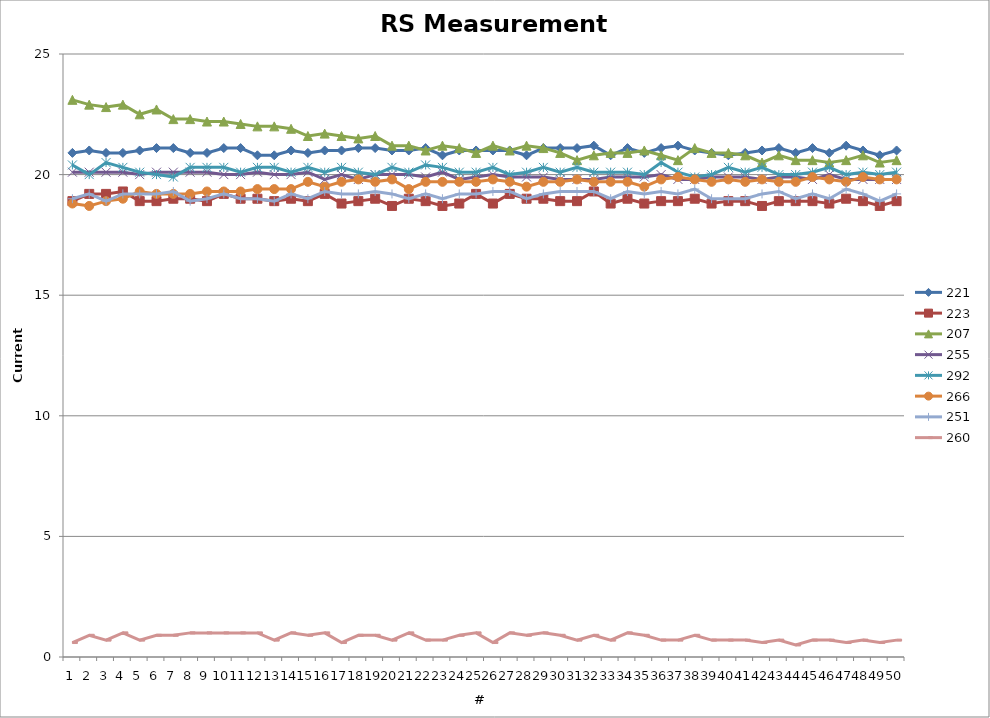
| Category | 221 | 223 | 207 | 255 | 292 | 266 | 251 | 260 |
|---|---|---|---|---|---|---|---|---|
| 0 | 20.9 | 18.9 | 23.1 | 20.1 | 20.4 | 18.8 | 19 | 0.6 |
| 1 | 21 | 19.2 | 22.9 | 20.1 | 20 | 18.7 | 19.2 | 0.9 |
| 2 | 20.9 | 19.2 | 22.8 | 20.1 | 20.5 | 18.9 | 18.9 | 0.7 |
| 3 | 20.9 | 19.3 | 22.9 | 20.1 | 20.3 | 19 | 19.2 | 1 |
| 4 | 21 | 18.9 | 22.5 | 20 | 20.1 | 19.3 | 19.2 | 0.7 |
| 5 | 21.1 | 18.9 | 22.7 | 20.1 | 20 | 19.2 | 19.2 | 0.9 |
| 6 | 21.1 | 19 | 22.3 | 20.1 | 19.9 | 19.2 | 19.3 | 0.9 |
| 7 | 20.9 | 19 | 22.3 | 20.1 | 20.3 | 19.2 | 18.9 | 1 |
| 8 | 20.9 | 18.9 | 22.2 | 20.1 | 20.3 | 19.3 | 19 | 1 |
| 9 | 21.1 | 19.2 | 22.2 | 20 | 20.3 | 19.3 | 19.2 | 1 |
| 10 | 21.1 | 19 | 22.1 | 20 | 20.1 | 19.3 | 19 | 1 |
| 11 | 20.8 | 19 | 22 | 20.1 | 20.3 | 19.4 | 19 | 1 |
| 12 | 20.8 | 18.9 | 22 | 20 | 20.3 | 19.4 | 18.9 | 0.7 |
| 13 | 21 | 19 | 21.9 | 20 | 20.1 | 19.4 | 19.2 | 1 |
| 14 | 20.9 | 18.9 | 21.6 | 20.1 | 20.3 | 19.7 | 19 | 0.9 |
| 15 | 21 | 19.2 | 21.7 | 19.8 | 20.1 | 19.5 | 19.3 | 1 |
| 16 | 21 | 18.8 | 21.6 | 20 | 20.3 | 19.7 | 19.2 | 0.6 |
| 17 | 21.1 | 18.9 | 21.5 | 19.8 | 20.1 | 19.8 | 19.2 | 0.9 |
| 18 | 21.1 | 19 | 21.6 | 20 | 20 | 19.7 | 19.3 | 0.9 |
| 19 | 21 | 18.7 | 21.2 | 20 | 20.3 | 19.8 | 19.2 | 0.7 |
| 20 | 21 | 19 | 21.2 | 20 | 20.1 | 19.4 | 19 | 1 |
| 21 | 21.1 | 18.9 | 21 | 19.9 | 20.4 | 19.7 | 19.2 | 0.7 |
| 22 | 20.8 | 18.7 | 21.2 | 20.1 | 20.3 | 19.7 | 19 | 0.7 |
| 23 | 21 | 18.8 | 21.1 | 19.8 | 20.1 | 19.7 | 19.2 | 0.9 |
| 24 | 21 | 19.2 | 20.9 | 19.9 | 20.1 | 19.7 | 19.2 | 1 |
| 25 | 21 | 18.8 | 21.2 | 20 | 20.3 | 19.8 | 19.3 | 0.6 |
| 26 | 21 | 19.2 | 21 | 19.9 | 20 | 19.7 | 19.3 | 1 |
| 27 | 20.8 | 19 | 21.2 | 19.9 | 20.1 | 19.5 | 19 | 0.9 |
| 28 | 21.1 | 19 | 21.1 | 19.9 | 20.3 | 19.7 | 19.2 | 1 |
| 29 | 21.1 | 18.9 | 20.9 | 19.8 | 20.1 | 19.7 | 19.3 | 0.9 |
| 30 | 21.1 | 18.9 | 20.6 | 19.8 | 20.3 | 19.8 | 19.3 | 0.7 |
| 31 | 21.2 | 19.3 | 20.8 | 19.8 | 20.1 | 19.7 | 19.3 | 0.9 |
| 32 | 20.8 | 18.8 | 20.9 | 19.9 | 20.1 | 19.7 | 19 | 0.7 |
| 33 | 21.1 | 19 | 20.9 | 19.9 | 20.1 | 19.7 | 19.3 | 1 |
| 34 | 20.9 | 18.8 | 21 | 19.9 | 20 | 19.5 | 19.2 | 0.9 |
| 35 | 21.1 | 18.9 | 20.8 | 20 | 20.5 | 19.8 | 19.3 | 0.7 |
| 36 | 21.2 | 18.9 | 20.6 | 19.8 | 20.1 | 19.9 | 19.2 | 0.7 |
| 37 | 21 | 19 | 21.1 | 19.8 | 19.9 | 19.8 | 19.4 | 0.9 |
| 38 | 20.9 | 18.8 | 20.9 | 19.9 | 20 | 19.7 | 19 | 0.7 |
| 39 | 20.8 | 18.9 | 20.9 | 19.9 | 20.3 | 19.8 | 19 | 0.7 |
| 40 | 20.9 | 18.9 | 20.8 | 19.9 | 20.1 | 19.7 | 19 | 0.7 |
| 41 | 21 | 18.7 | 20.5 | 19.8 | 20.3 | 19.8 | 19.2 | 0.6 |
| 42 | 21.1 | 18.9 | 20.8 | 19.9 | 20 | 19.7 | 19.3 | 0.7 |
| 43 | 20.9 | 18.9 | 20.6 | 19.9 | 20 | 19.7 | 19 | 0.5 |
| 44 | 21.1 | 18.9 | 20.6 | 19.8 | 20.1 | 19.9 | 19.2 | 0.7 |
| 45 | 20.9 | 18.8 | 20.5 | 20 | 20.3 | 19.8 | 19 | 0.7 |
| 46 | 21.2 | 19 | 20.6 | 19.8 | 20 | 19.7 | 19.4 | 0.6 |
| 47 | 21 | 18.9 | 20.8 | 19.8 | 20.1 | 19.9 | 19.2 | 0.7 |
| 48 | 20.8 | 18.7 | 20.5 | 19.8 | 20 | 19.8 | 18.9 | 0.6 |
| 49 | 21 | 18.9 | 20.6 | 19.8 | 20.1 | 19.8 | 19.2 | 0.7 |